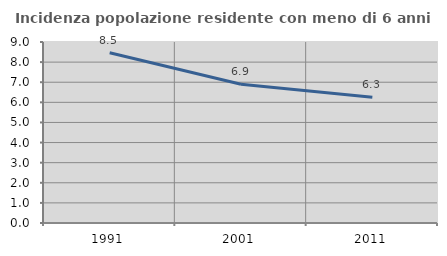
| Category | Incidenza popolazione residente con meno di 6 anni |
|---|---|
| 1991.0 | 8.462 |
| 2001.0 | 6.897 |
| 2011.0 | 6.258 |